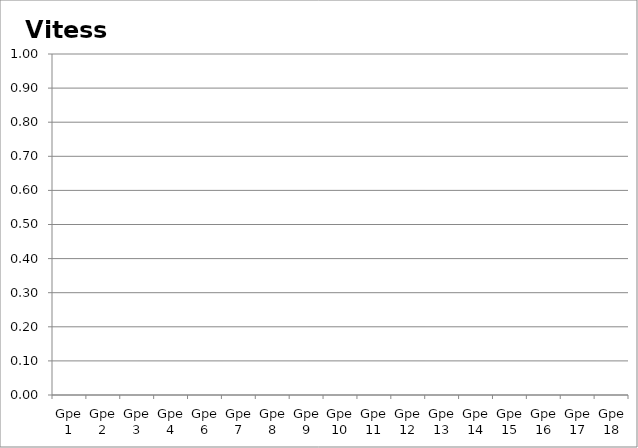
| Category | Vitesse |
|---|---|
| Gpe 1 | 0 |
| Gpe 2 | 0 |
| Gpe 3 | 0 |
| Gpe 4 | 0 |
| Gpe 6 | 0 |
| Gpe 7 | 0 |
| Gpe 8 | 0 |
| Gpe 9 | 0 |
| Gpe 10 | 0 |
| Gpe 11 | 0 |
| Gpe 12 | 0 |
| Gpe 13 | 0 |
| Gpe 14 | 0 |
| Gpe 15 | 0 |
| Gpe 16 | 0 |
| Gpe 17 | 0 |
| Gpe 18 | 0 |